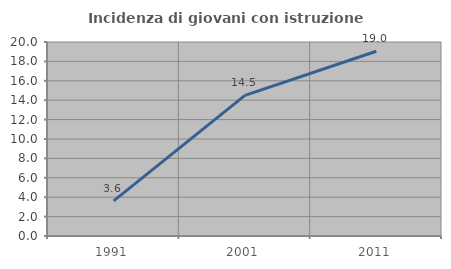
| Category | Incidenza di giovani con istruzione universitaria |
|---|---|
| 1991.0 | 3.614 |
| 2001.0 | 14.493 |
| 2011.0 | 19.048 |